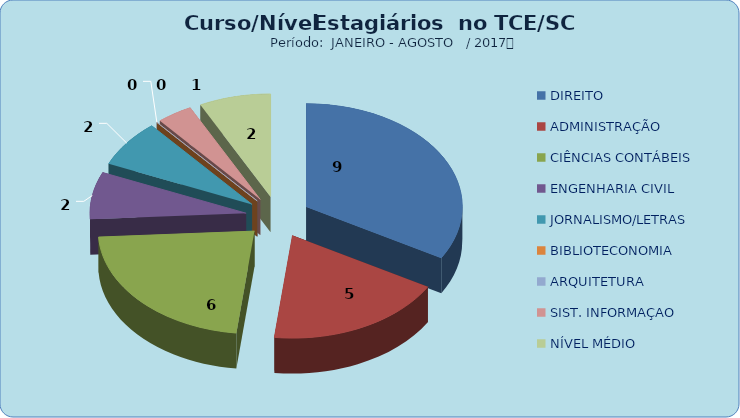
| Category | Series 0 |
|---|---|
| DIREITO | 9 |
| ADMINISTRAÇÃO | 5 |
| CIÊNCIAS CONTÁBEIS | 6 |
| ENGENHARIA CIVIL | 2 |
| JORNALISMO/LETRAS | 2 |
| BIBLIOTECONOMIA | 0 |
| ARQUITETURA | 0 |
| SIST. INFORMAÇAO | 1 |
| NÍVEL MÉDIO | 2 |